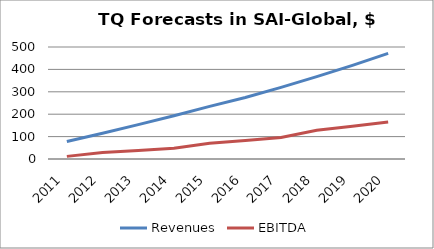
| Category | Revenues | EBITDA |
|---|---|---|
| 2011.0 | 77.875 | 11.681 |
| 2012.0 | 114.865 | 28.716 |
| 2013.0 | 153.335 | 38.334 |
| 2014.0 | 193.343 | 48.336 |
| 2015.0 | 234.952 | 70.486 |
| 2016.0 | 274.581 | 82.374 |
| 2017.0 | 319.676 | 95.903 |
| 2018.0 | 367.477 | 128.617 |
| 2019.0 | 418.145 | 146.351 |
| 2020.0 | 471.855 | 165.149 |